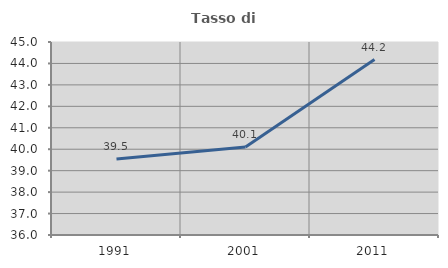
| Category | Tasso di occupazione   |
|---|---|
| 1991.0 | 39.546 |
| 2001.0 | 40.106 |
| 2011.0 | 44.179 |